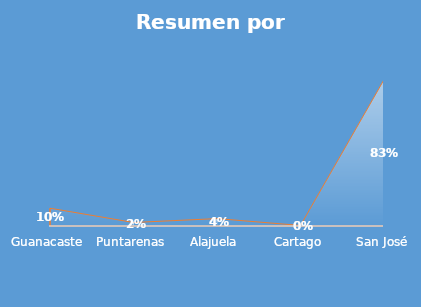
| Category | PORCENTAJE |
|---|---|
| Guanacaste | 0.101 |
| Puntarenas | 0.02 |
| Alajuela | 0.042 |
| Cartago | 0.003 |
| San José | 0.833 |